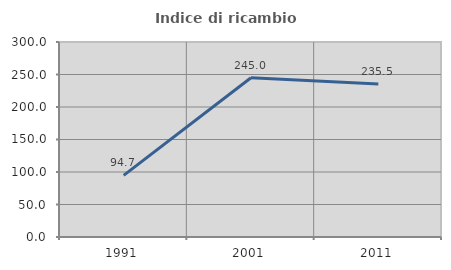
| Category | Indice di ricambio occupazionale  |
|---|---|
| 1991.0 | 94.737 |
| 2001.0 | 245 |
| 2011.0 | 235.484 |